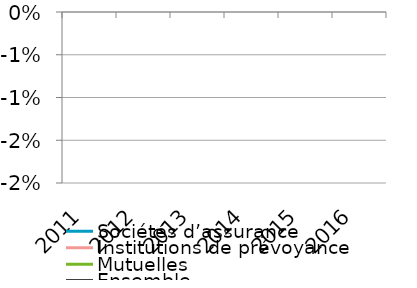
| Category | Sociétés d’assurance | Institutions de prévoyance | Mutuelles | Ensemble |
|---|---|---|---|---|
| 2011.0 | 0 | 0 | 0 | 0 |
| 2012.0 | 0 | 0 | 0 | 0 |
| 2013.0 | 0 | 0 | 0 | 0 |
| 2014.0 | 0 | 0 | 0 | 0 |
| 2015.0 | 0 | 0 | 0 | 0 |
| 2016.0 | 0 | 0 | 0 | 0 |